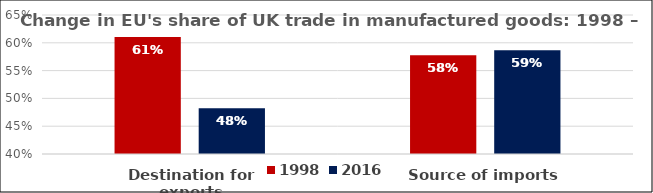
| Category | 1998 | 2016 |
|---|---|---|
| Destination for exports | 0.611 | 0.482 |
| Source of imports | 0.578 | 0.586 |